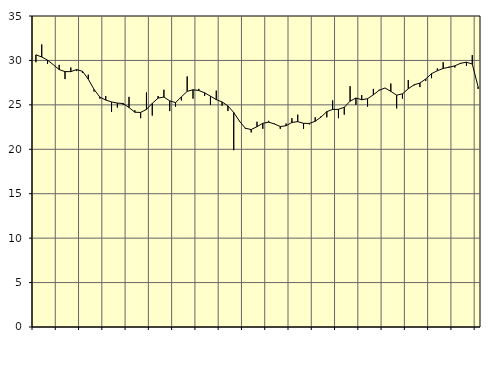
| Category | Piggar | Series 1 |
|---|---|---|
| nan | 29.8 | 30.63 |
| 1.0 | 31.8 | 30.39 |
| 1.0 | 29.6 | 30.03 |
| 1.0 | 29.5 | 29.51 |
| nan | 29.5 | 28.97 |
| 2.0 | 27.9 | 28.74 |
| 2.0 | 29.2 | 28.74 |
| 2.0 | 28.8 | 28.97 |
| nan | 28.6 | 28.78 |
| 3.0 | 28.4 | 27.89 |
| 3.0 | 26.5 | 26.73 |
| 3.0 | 25.7 | 25.87 |
| nan | 26 | 25.54 |
| 4.0 | 24.2 | 25.33 |
| 4.0 | 24.7 | 25.2 |
| 4.0 | 25 | 25.15 |
| nan | 25.9 | 24.7 |
| 5.0 | 24.4 | 24.17 |
| 5.0 | 23.5 | 24.15 |
| 5.0 | 26.4 | 24.49 |
| nan | 23.8 | 25.17 |
| 6.0 | 26 | 25.76 |
| 6.0 | 26.7 | 25.88 |
| 6.0 | 24.3 | 25.45 |
| nan | 24.8 | 25.25 |
| 7.0 | 25.5 | 25.9 |
| 7.0 | 28.2 | 26.52 |
| 7.0 | 25.7 | 26.7 |
| nan | 26.8 | 26.61 |
| 8.0 | 26 | 26.36 |
| 8.0 | 25 | 25.98 |
| 8.0 | 26.6 | 25.59 |
| nan | 24.9 | 25.33 |
| 9.0 | 24.3 | 24.88 |
| 9.0 | 19.9 | 24.14 |
| 9.0 | 23.2 | 23.16 |
| nan | 22.3 | 22.37 |
| 10.0 | 21.9 | 22.22 |
| 10.0 | 23.1 | 22.54 |
| 10.0 | 22.3 | 22.93 |
| nan | 23.2 | 23.05 |
| 11.0 | 22.9 | 22.85 |
| 11.0 | 22.3 | 22.56 |
| 11.0 | 22.9 | 22.65 |
| nan | 23.5 | 23.02 |
| 12.0 | 23.9 | 23.11 |
| 12.0 | 22.3 | 22.92 |
| 12.0 | 22.8 | 22.91 |
| nan | 23.6 | 23.15 |
| 13.0 | 23.7 | 23.62 |
| 13.0 | 23.6 | 24.24 |
| 13.0 | 25.5 | 24.48 |
| nan | 23.5 | 24.5 |
| 14.0 | 23.9 | 24.73 |
| 14.0 | 27.1 | 25.41 |
| 14.0 | 25 | 25.77 |
| nan | 26.1 | 25.58 |
| 15.0 | 24.8 | 25.69 |
| 15.0 | 26.8 | 26.13 |
| 15.0 | 26.7 | 26.64 |
| nan | 26.9 | 26.9 |
| 16.0 | 27.4 | 26.52 |
| 16.0 | 24.6 | 26.09 |
| 16.0 | 25.7 | 26.24 |
| nan | 27.8 | 26.81 |
| 17.0 | 27.2 | 27.26 |
| 17.0 | 27 | 27.45 |
| 17.0 | 27.7 | 27.91 |
| nan | 28 | 28.51 |
| 18.0 | 29.1 | 28.84 |
| 18.0 | 29.8 | 29.1 |
| 18.0 | 29.3 | 29.23 |
| nan | 29.2 | 29.39 |
| 19.0 | 29.6 | 29.68 |
| 19.0 | 29.4 | 29.8 |
| 19.0 | 30.6 | 29.59 |
| nan | 26.8 | 27.03 |